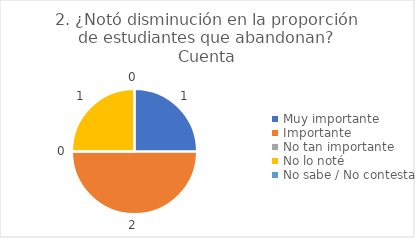
| Category | 2. ¿Notó disminución en la proporción de estudiantes que abandonan? |
|---|---|
| Muy importante  | 0.25 |
| Importante  | 0.5 |
| No tan importante  | 0 |
| No lo noté  | 0.25 |
| No sabe / No contesta | 0 |